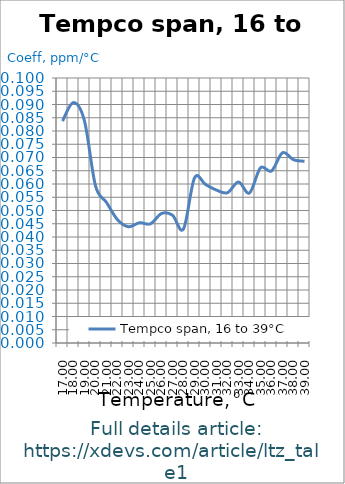
| Category | Tempco span, 16 to 39°C |
|---|---|
| 17.0 | 0.084 |
| 18.0 | 0.091 |
| 19.0 | 0.084 |
| 20.0 | 0.059 |
| 21.0 | 0.053 |
| 22.0 | 0.047 |
| 23.0 | 0.044 |
| 24.0 | 0.045 |
| 25.0 | 0.045 |
| 26.0 | 0.049 |
| 27.0 | 0.048 |
| 28.0 | 0.043 |
| 29.0 | 0.062 |
| 30.0 | 0.06 |
| 31.0 | 0.058 |
| 32.0 | 0.057 |
| 33.0 | 0.061 |
| 34.0 | 0.057 |
| 35.0 | 0.066 |
| 36.0 | 0.065 |
| 37.0 | 0.072 |
| 38.0 | 0.069 |
| 39.0 | 0.069 |